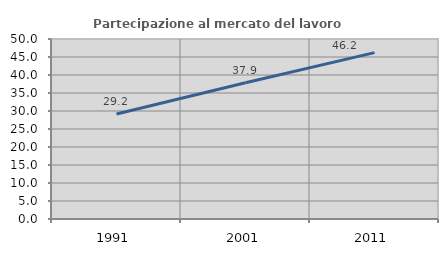
| Category | Partecipazione al mercato del lavoro  femminile |
|---|---|
| 1991.0 | 29.174 |
| 2001.0 | 37.86 |
| 2011.0 | 46.208 |